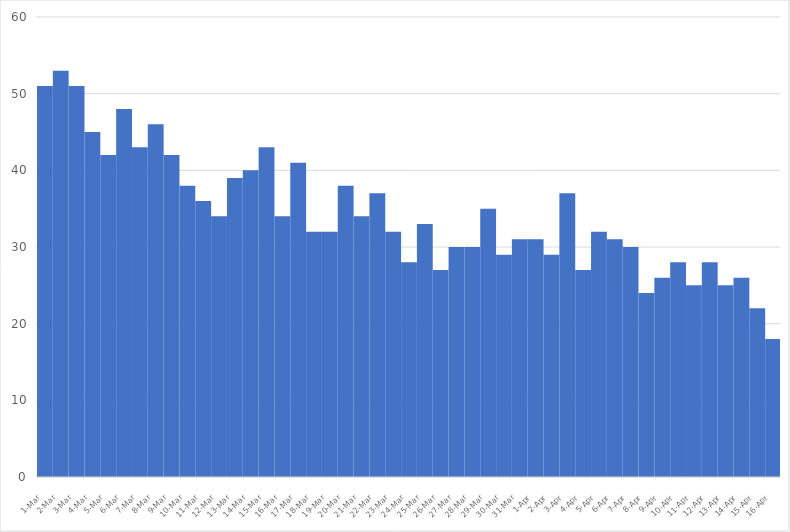
| Category | Series 0 |
|---|---|
| 2017-03-01 | 51 |
| 2017-03-02 | 53 |
| 2017-03-03 | 51 |
| 2017-03-04 | 45 |
| 2017-03-05 | 42 |
| 2017-03-06 | 48 |
| 2017-03-07 | 43 |
| 2017-03-08 | 46 |
| 2017-03-09 | 42 |
| 2017-03-10 | 38 |
| 2017-03-11 | 36 |
| 2017-03-12 | 34 |
| 2017-03-13 | 39 |
| 2017-03-14 | 40 |
| 2017-03-15 | 43 |
| 2017-03-16 | 34 |
| 2017-03-17 | 41 |
| 2017-03-18 | 32 |
| 2017-03-19 | 32 |
| 2017-03-20 | 38 |
| 2017-03-21 | 34 |
| 2017-03-22 | 37 |
| 2017-03-23 | 32 |
| 2017-03-24 | 28 |
| 2017-03-25 | 33 |
| 2017-03-26 | 27 |
| 2017-03-27 | 30 |
| 2017-03-28 | 30 |
| 2017-03-29 | 35 |
| 2017-03-30 | 29 |
| 2017-03-31 | 31 |
| 2017-04-01 | 31 |
| 2017-04-02 | 29 |
| 2017-04-03 | 37 |
| 2017-04-04 | 27 |
| 2017-04-05 | 32 |
| 2017-04-06 | 31 |
| 2017-04-07 | 30 |
| 2017-04-08 | 24 |
| 2017-04-09 | 26 |
| 2017-04-10 | 28 |
| 2017-04-11 | 25 |
| 2017-04-12 | 28 |
| 2017-04-13 | 25 |
| 2017-04-14 | 26 |
| 2017-04-15 | 22 |
| 2017-04-16 | 18 |